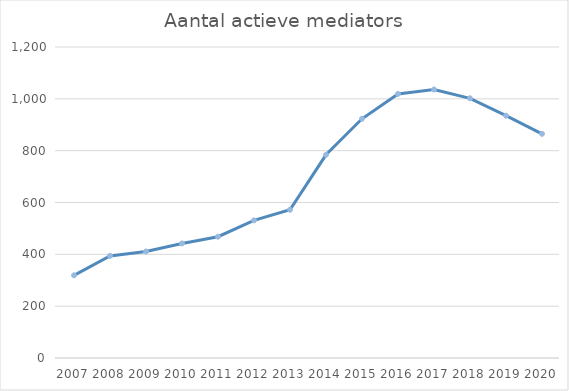
| Category | Mediators die toevoegingen hebben behandeld |
|---|---|
| 2007.0 | 319 |
| 2008.0 | 394 |
| 2009.0 | 411 |
| 2010.0 | 442 |
| 2011.0 | 468 |
| 2012.0 | 531 |
| 2013.0 | 572 |
| 2014.0 | 784 |
| 2015.0 | 923 |
| 2016.0 | 1019 |
| 2017.0 | 1036 |
| 2018.0 | 1002 |
| 2019.0 | 935 |
| 2020.0 | 865 |